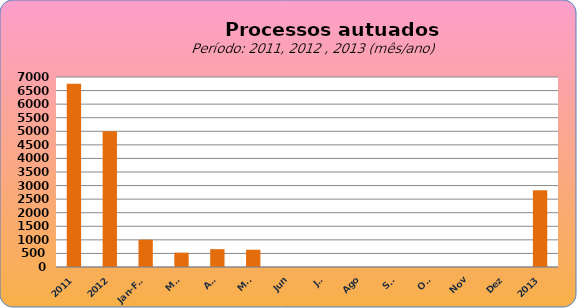
| Category | 6749 4998 1006 527 657 636 0 0 0 0 0 0 0 |
|---|---|
| 2011 | 6749 |
| 2012 | 4998 |
| Jan-Fev | 1006 |
| Mar | 527 |
| Abr | 657 |
| Mai | 636 |
| Jun | 0 |
| Jul | 0 |
| Ago | 0 |
| Set | 0 |
| Out | 0 |
| Nov | 0 |
| Dez | 0 |
| 2013 | 2826 |